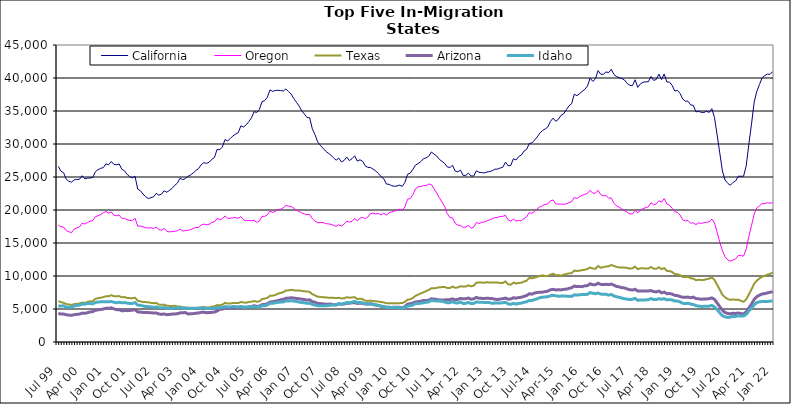
| Category | California | Oregon | Texas | Arizona | Idaho |
|---|---|---|---|---|---|
| Jul 99 | 26605 | 17749 | 6209 | 4339 | 5471 |
| Aug 99 | 25882 | 17447 | 6022 | 4228 | 5444 |
| Sep 99 | 25644 | 17401 | 5941 | 4237 | 5488 |
| Oct 99 | 24669 | 16875 | 5751 | 4134 | 5279 |
| Nov 99 | 24353 | 16701 | 5680 | 4073 | 5260 |
| Dec 99 | 24218 | 16570 | 5619 | 4042 | 5269 |
| Jan 00 | 24574 | 17109 | 5736 | 4142 | 5485 |
| Feb 00 | 24620 | 17295 | 5789 | 4192 | 5530 |
| Mar 00 | 24655 | 17436 | 5826 | 4226 | 5590 |
| Apr 00 | 25195 | 18009 | 5980 | 4375 | 5748 |
| May 00 | 24730 | 17875 | 5897 | 4337 | 5729 |
| Jun 00 | 24825 | 18113 | 6070 | 4444 | 5853 |
| Jul 00 | 24857 | 18294 | 6163 | 4555 | 5824 |
| Aug 00 | 24913 | 18376 | 6199 | 4603 | 5788 |
| Sep 00 | 25792 | 18971 | 6529 | 4804 | 5976 |
| Oct 00 | 26106 | 19135 | 6643 | 4870 | 6058 |
| Nov 00 | 26315 | 19306 | 6705 | 4926 | 6085 |
| Dec 00 | 26415 | 19570 | 6793 | 4991 | 6096 |
| Jan 01 | 26995 | 19781 | 6942 | 5122 | 6119 |
| Feb 01 | 26851 | 19519 | 6948 | 5089 | 6090 |
| Mar 01 | 27352 | 19720 | 7080 | 5180 | 6143 |
| Apr 01 | 26918 | 19221 | 6943 | 5020 | 6020 |
| May 01 | 26848 | 19126 | 6924 | 4899 | 5950 |
| Jun 01 | 26974 | 19241 | 6959 | 4895 | 6019 |
| Jul 01 | 26172 | 18725 | 6778 | 4737 | 5951 |
| Aug 01 | 25943 | 18736 | 6810 | 4757 | 5973 |
| Sep 01 | 25399 | 18514 | 6688 | 4753 | 5895 |
| Oct 01 | 25050 | 18415 | 6650 | 4780 | 5833 |
| Nov 01 | 24873 | 18381 | 6631 | 4826 | 5850 |
| Dec 01 | 25099 | 18765 | 6708 | 4898 | 5969 |
| Jan 02 | 23158 | 17561 | 6261 | 4560 | 5595 |
| Feb 02 | 22926 | 17573 | 6162 | 4531 | 5560 |
| Mar 02 | 22433 | 17452 | 6052 | 4481 | 5458 |
| Apr 02 | 22012 | 17314 | 6046 | 4458 | 5380 |
| May 02 | 21733 | 17267 | 6007 | 4452 | 5358 |
| Jun 02 | 21876 | 17298 | 5933 | 4444 | 5315 |
| Jul 02 | 21997 | 17209 | 5873 | 4383 | 5243 |
| Aug 02 | 22507 | 17436 | 5929 | 4407 | 5315 |
| Sep 02 | 22244 | 17010 | 5672 | 4248 | 5192 |
| Oct 02 | 22406 | 16952 | 5625 | 4191 | 5167 |
| Nov 02 | 22922 | 17223 | 5663 | 4242 | 5221 |
| Dec 02 | 22693 | 16770 | 5499 | 4142 | 5120 |
| Jan 03 | 22964 | 16694 | 5463 | 4166 | 5089 |
| Feb 03 | 23276 | 16727 | 5461 | 4226 | 5077 |
| Mar 03 | 23736 | 16766 | 5486 | 4251 | 5145 |
| Apr 03 | 24079 | 16859 | 5389 | 4289 | 5145 |
| May 03 | 24821 | 17117 | 5378 | 4415 | 5254 |
| Jun 03 | 24592 | 16812 | 5273 | 4426 | 5135 |
| Jul 03 | 24754 | 16875 | 5226 | 4466 | 5124 |
| Aug 03 | 25092 | 16922 | 5181 | 4244 | 5100 |
| Sep 03 | 25316 | 17036 | 5181 | 4279 | 5086 |
| Oct 03 | 25622 | 17228 | 5139 | 4301 | 5110 |
| Nov 03 | 25984 | 17335 | 5175 | 4362 | 5091 |
| Dec 03 | 26269 | 17350 | 5189 | 4396 | 5113 |
| Jan 04 | 26852 | 17734 | 5255 | 4492 | 5152 |
| Feb 04 | 27184 | 17860 | 5301 | 4502 | 5183 |
| Mar 04 | 27062 | 17757 | 5227 | 4443 | 5056 |
| Apr 04 | 27238 | 17840 | 5227 | 4461 | 5104 |
| May 04 | 27671 | 18113 | 5345 | 4493 | 5095 |
| Jun 04 | 27949 | 18201 | 5416 | 4532 | 5103 |
| Jul 04 | 29172 | 18727 | 5597 | 4697 | 5231 |
| Aug 04 | 29122 | 18529 | 5561 | 4945 | 5197 |
| Sep 04 | 29542 | 18678 | 5656 | 4976 | 5237 |
| Oct 04 | 30674 | 19108 | 5922 | 5188 | 5363 |
| Nov 04 | 30472 | 18716 | 5823 | 5106 | 5321 |
| Dec 04 | 30831 | 18755 | 5838 | 5135 | 5312 |
| Jan 05 | 31224 | 18823 | 5906 | 5155 | 5374 |
| Feb 05 | 31495 | 18842 | 5898 | 5168 | 5357 |
| Mar 05 | 31714 | 18738 | 5894 | 5212 | 5313 |
| Apr 05 | 32750 | 18998 | 6060 | 5340 | 5350 |
| May 05 | 32575 | 18504 | 5989 | 5269 | 5276 |
| Jun 05 | 32898 | 18414 | 5954 | 5252 | 5271 |
| Jul 05 | 33384 | 18395 | 6062 | 5322 | 5322 |
| Aug 05 | 33964 | 18381 | 6113 | 5375 | 5316 |
| Sep 05 | 34897 | 18426 | 6206 | 5493 | 5362 |
| Oct 05 | 34780 | 18132 | 6100 | 5408 | 5308 |
| Nov 05 | 35223 | 18332 | 6162 | 5434 | 5314 |
| Dec 05 | 36415 | 19047 | 6508 | 5658 | 5487 |
| Jan 06 | 36567 | 19032 | 6576 | 5688 | 5480 |
| Feb 06 | 37074 | 19257 | 6692 | 5792 | 5616 |
| Mar 06 | 38207 | 19845 | 6993 | 6052 | 5850 |
| Apr 06 | 37976 | 19637 | 7024 | 6101 | 5864 |
| May 06 | 38099 | 19781 | 7114 | 6178 | 5943 |
| Jun 06 | 38141 | 20061 | 7331 | 6276 | 6018 |
| Jul 06 | 38097 | 20111 | 7431 | 6399 | 6046 |
| Aug 06 | 38021 | 20333 | 7542 | 6450 | 6064 |
| Sep 06 | 38349 | 20686 | 7798 | 6627 | 6232 |
| Oct 06 | 37947 | 20591 | 7825 | 6647 | 6216 |
| Nov 06 | 37565 | 20526 | 7907 | 6707 | 6244 |
| Dec 06 | 36884 | 20272 | 7840 | 6648 | 6192 |
| Jan 07 | 36321 | 19984 | 7789 | 6597 | 6151 |
| Feb 07 | 35752 | 19752 | 7799 | 6554 | 6048 |
| Mar 07 | 35025 | 19547 | 7737 | 6487 | 5989 |
| Apr 07 | 34534 | 19412 | 7685 | 6430 | 5937 |
| May 07 | 34022 | 19296 | 7654 | 6353 | 5858 |
| Jun 07 | 33974 | 19318 | 7577 | 6390 | 5886 |
| Jul 07 | 32298 | 18677 | 7250 | 6117 | 5682 |
| Aug 07 | 31436 | 18322 | 7070 | 6034 | 5617 |
| Sep 07 | 30331 | 18087 | 6853 | 5847 | 5500 |
| Oct 07 | 29813 | 18108 | 6839 | 5821 | 5489 |
| Nov 07 | 29384 | 18105 | 6777 | 5769 | 5481 |
| Dec 07 | 28923 | 17949 | 6760 | 5733 | 5499 |
| Jan 08 | 28627 | 17890 | 6721 | 5732 | 5521 |
| Feb 08 | 28328 | 17834 | 6719 | 5749 | 5579 |
| Mar 08 | 27911 | 17680 | 6690 | 5650 | 5614 |
| Apr 08 | 27543 | 17512 | 6656 | 5612 | 5635 |
| May 08 | 27856 | 17754 | 6705 | 5774 | 5798 |
| Jun 08 | 27287 | 17589 | 6593 | 5717 | 5745 |
| Jul 08 | 27495 | 17834 | 6623 | 5761 | 5807 |
| Aug 08 | 28018 | 18309 | 6789 | 5867 | 5982 |
| Sep-08 | 27491 | 18164 | 6708 | 5864 | 5954 |
| Oct 08 | 27771 | 18291 | 6755 | 5942 | 6032 |
| Nov 08 | 28206 | 18706 | 6787 | 5970 | 6150 |
| Dec 08 | 27408 | 18353 | 6505 | 5832 | 5975 |
| Jan 09 | 27601 | 18778 | 6569 | 5890 | 5995 |
| Feb 09 | 27394 | 18863 | 6483 | 5845 | 5936 |
| Mar 09 | 26690 | 18694 | 6273 | 5751 | 5806 |
| Apr 09 | 26461 | 18943 | 6222 | 5735 | 5777 |
| May 09 | 26435 | 19470 | 6272 | 5819 | 5767 |
| Jun 09 | 26187 | 19522 | 6199 | 5700 | 5649 |
| Jul 09 | 25906 | 19408 | 6171 | 5603 | 5617 |
| Aug 09 | 25525 | 19469 | 6128 | 5533 | 5540 |
| Sep 09 | 25050 | 19249 | 6059 | 5405 | 5437 |
| Oct 09 | 24741 | 19529 | 6004 | 5349 | 5369 |
| Nov 09 | 23928 | 19187 | 5854 | 5271 | 5248 |
| Dec 09 | 23899 | 19607 | 5886 | 5261 | 5195 |
| Jan 10 | 23676 | 19703 | 5881 | 5232 | 5234 |
| Feb 10 | 23592 | 19845 | 5850 | 5272 | 5236 |
| Mar 10 | 23634 | 19946 | 5864 | 5278 | 5219 |
| Apr 10 | 23774 | 20134 | 5889 | 5257 | 5201 |
| May 10 | 23567 | 19966 | 5897 | 5172 | 5105 |
| Jun 10 | 24166 | 20464 | 6087 | 5356 | 5237 |
| Jul 10 | 25410 | 21627 | 6417 | 5742 | 5452 |
| Aug 10 | 25586 | 21744 | 6465 | 5797 | 5491 |
| Sep 10 | 26150 | 22314 | 6667 | 5907 | 5609 |
| Oct 10 | 26807 | 23219 | 6986 | 6070 | 5831 |
| Nov 10 | 27033 | 23520 | 7179 | 6100 | 5810 |
| Dec 10 | 27332 | 23551 | 7361 | 6182 | 5898 |
| Jan 11 | 27769 | 23697 | 7525 | 6276 | 5938 |
| Feb 11 | 27898 | 23718 | 7708 | 6267 | 6016 |
| Mar 11 | 28155 | 23921 | 7890 | 6330 | 6081 |
| Apr 11 | 28790 | 23847 | 8146 | 6544 | 6305 |
| May 11 | 28471 | 23215 | 8131 | 6502 | 6248 |
| Jun 11 | 28191 | 22580 | 8199 | 6445 | 6217 |
| Jul 11 | 27678 | 21867 | 8291 | 6368 | 6202 |
| Aug 11 | 27372 | 21203 | 8321 | 6356 | 6146 |
| Sep 11 | 27082 | 20570 | 8341 | 6387 | 6075 |
| Oct 11 | 26528 | 19442 | 8191 | 6402 | 5932 |
| Nov 11 | 26440 | 18872 | 8176 | 6426 | 5968 |
| Dec 11 | 26770 | 18784 | 8401 | 6533 | 6106 |
| Jan 12 | 25901 | 17963 | 8202 | 6390 | 5933 |
| Feb 12 | 25796 | 17718 | 8266 | 6456 | 5900 |
| Mar 12 | 26042 | 17647 | 8456 | 6600 | 6054 |
| Apr 12 | 25239 | 17386 | 8388 | 6534 | 5838 |
| May 12 | 25238 | 17407 | 8401 | 6558 | 5854 |
| Jun 12 | 25593 | 17673 | 8594 | 6669 | 6009 |
| Jul 12 | 25155 | 17237 | 8432 | 6474 | 5817 |
| Aug 12 | 25146 | 17391 | 8536 | 6539 | 5842 |
| Sep 12 | 25942 | 18102 | 8989 | 6759 | 6061 |
| Oct 12 | 25718 | 17953 | 9012 | 6618 | 6027 |
| Nov 12 | 25677 | 18134 | 9032 | 6611 | 6009 |
| Dec 12 | 25619 | 18166 | 8981 | 6601 | 5999 |
| Jan 13 | 25757 | 18344 | 9051 | 6627 | 5989 |
| Feb-13 | 25830 | 18512 | 9001 | 6606 | 5968 |
| Mar-13 | 25940 | 18689 | 9021 | 6577 | 5853 |
| Apr 13 | 26187 | 18844 | 9013 | 6478 | 5925 |
| May 13 | 26192 | 18884 | 9003 | 6431 | 5924 |
| Jun-13 | 26362 | 19013 | 8948 | 6508 | 5896 |
| Jul 13 | 26467 | 19037 | 8958 | 6559 | 5948 |
| Aug 13 | 27253 | 19198 | 9174 | 6655 | 6020 |
| Sep 13 | 26711 | 18501 | 8747 | 6489 | 5775 |
| Oct 13 | 26733 | 18301 | 8681 | 6511 | 5711 |
| Nov 13 | 27767 | 18620 | 8989 | 6709 | 5860 |
| Dec 13 | 27583 | 18320 | 8863 | 6637 | 5740 |
| Jan 14 | 28107 | 18409 | 8939 | 6735 | 5843 |
| Feb-14 | 28313 | 18383 | 8989 | 6779 | 5893 |
| Mar 14 | 28934 | 18696 | 9160 | 6918 | 6015 |
| Apr 14 | 29192 | 18946 | 9291 | 7036 | 6099 |
| May 14 | 30069 | 19603 | 9701 | 7314 | 6304 |
| Jun 14 | 30163 | 19487 | 9641 | 7252 | 6293 |
| Jul-14 | 30587 | 19754 | 9752 | 7415 | 6427 |
| Aug-14 | 31074 | 20201 | 9882 | 7499 | 6557 |
| Sep 14 | 31656 | 20459 | 9997 | 7536 | 6719 |
| Oct 14 | 32037 | 20663 | 10109 | 7555 | 6786 |
| Nov 14 | 32278 | 20825 | 9992 | 7628 | 6831 |
| Dec 14 | 32578 | 20918 | 10006 | 7705 | 6860 |
| Jan 15 | 33414 | 21396 | 10213 | 7906 | 7000 |
| Feb 15 | 33922 | 21518 | 10337 | 7982 | 7083 |
| Mar 15 | 33447 | 20942 | 10122 | 7891 | 7006 |
| Apr-15 | 33731 | 20893 | 10138 | 7906 | 6931 |
| May 15 | 34343 | 20902 | 10053 | 7895 | 6952 |
| Jun-15 | 34572 | 20870 | 10192 | 7973 | 6966 |
| Jul 15 | 35185 | 20916 | 10303 | 8000 | 6949 |
| Aug 15 | 35780 | 21115 | 10399 | 8126 | 6938 |
| Sep 15 | 36109 | 21246 | 10428 | 8207 | 6896 |
| Oct 15 | 37555 | 21908 | 10813 | 8477 | 7140 |
| Nov 15 | 37319 | 21750 | 10763 | 8390 | 7112 |
| Dec 15 | 37624 | 21990 | 10807 | 8395 | 7149 |
| Jan 16 | 37978 | 22248 | 10892 | 8388 | 7201 |
| Feb 16 | 38285 | 22369 | 10951 | 8508 | 7192 |
| Mar 16 | 38792 | 22506 | 11075 | 8547 | 7226 |
| Apr 16 | 39994 | 22999 | 11286 | 8815 | 7487 |
| May 16 | 39488 | 22548 | 11132 | 8673 | 7382 |
| Jun 16 | 39864 | 22556 | 11100 | 8682 | 7315 |
| Jul 16 | 41123 | 22989 | 11516 | 8903 | 7420 |
| Aug 16 | 40573 | 22333 | 11251 | 8731 | 7261 |
| Sep 16 | 40560 | 22162 | 11340 | 8692 | 7216 |
| Oct 16 | 40923 | 22172 | 11456 | 8742 | 7233 |
| Nov 16 | 40817 | 21818 | 11459 | 8685 | 7101 |
| Dec 16 | 41311 | 21815 | 11681 | 8783 | 7203 |
| Jan 17 | 40543 | 21029 | 11524 | 8609 | 6982 |
| Feb 17 | 40218 | 20613 | 11385 | 8416 | 6852 |
| Mar 17 | 40052 | 20425 | 11276 | 8354 | 6775 |
| Apr 17 | 39913 | 20147 | 11297 | 8218 | 6653 |
| May 17 | 39695 | 19910 | 11265 | 8196 | 6552 |
| Jun 17 | 39177 | 19650 | 11225 | 8034 | 6500 |
| Jul 17 | 38901 | 19419 | 11115 | 7923 | 6429 |
| Aug 17 | 38827 | 19389 | 11168 | 7867 | 6479 |
| Sep 17 | 39736 | 19936 | 11426 | 7991 | 6609 |
| Oct 17 | 38576 | 19547 | 11041 | 7708 | 6315 |
| Nov 17 | 39108 | 20013 | 11158 | 7746 | 6381 |
| Dec 17 | 39359 | 20202 | 11185 | 7743 | 6366 |
| Jan 18 | 39420 | 20362 | 11118 | 7736 | 6380 |
| Feb 18 | 39440 | 20476 | 11128 | 7741 | 6407 |
| Mar 18 | 40218 | 21106 | 11362 | 7789 | 6578 |
| Apr 18 | 39637 | 20788 | 11111 | 7642 | 6423 |
| May 18 | 39777 | 20933 | 11097 | 7591 | 6430 |
| Jun 18 | 40602 | 21381 | 11317 | 7721 | 6554 |
| Jul 18 | 39767 | 21189 | 11038 | 7445 | 6489 |
| Aug 18 | 40608 | 21729 | 11200 | 7560 | 6569 |
| Sep 18 | 39395 | 20916 | 10772 | 7318 | 6383 |
| Oct 18 | 39383 | 20724 | 10740 | 7344 | 6429 |
| Nov 18 | 38891 | 20265 | 10605 | 7255 | 6365 |
| Dec 18 | 38013 | 19741 | 10292 | 7069 | 6205 |
| Jan 19 | 38130 | 19643 | 10261 | 7032 | 6203 |
| Feb 19 | 37658 | 19237 | 10132 | 6892 | 6073 |
| Mar 19 | 36831 | 18492 | 9848 | 6766 | 5863 |
| Apr 19 | 36492 | 18349 | 9839 | 6763 | 5827 |
| May 19 | 36481 | 18407 | 9867 | 6809 | 5873 |
| Jun 19 | 35925 | 17998 | 9661 | 6698 | 5761 |
| Jul 19 | 35843 | 18049 | 9598 | 6800 | 5673 |
| Aug 19 | 34870 | 17785 | 9361 | 6577 | 5512 |
| Sep 19 | 34945 | 18038 | 9428 | 6547 | 5437 |
| Oct 19 | 34802 | 17977 | 9385 | 6483 | 5390 |
| Nov 19 | 34775 | 18072 | 9403 | 6511 | 5401 |
| Dec 19 | 34976 | 18140 | 9518 | 6521 | 5419 |
| Jan 20 | 34774 | 18209 | 9594 | 6561 | 5434 |
| Feb 20 | 35352 | 18632 | 9804 | 6682 | 5543 |
| Mar 20 | 34013 | 18041 | 9411 | 6464 | 5330 |
| Apr 20 | 31385 | 16629 | 8666 | 5922 | 4906 |
| May 20 | 28657 | 15123 | 7927 | 5355 | 4419 |
| Jun 20 | 25915 | 13817 | 7164 | 4815 | 3992 |
| Jul 20 | 24545 | 12926 | 6776 | 4457 | 3810 |
| Aug 20 | 24048 | 12443 | 6521 | 4326 | 3720 |
| Sep 20 | 23756 | 12258 | 6386 | 4266 | 3784 |
| Oct 20 | 24166 | 12429 | 6452 | 4347 | 3861 |
| Nov 20 | 24404 | 12597 | 6386 | 4324 | 3883 |
| Dec 20 | 25120 | 13122 | 6420 | 4394 | 3974 |
| Jan 21 | 25111 | 13080 | 6236 | 4304 | 3924 |
| Feb 21 | 25114 | 13015 | 6094 | 4260 | 3930 |
| Mar 21 | 26701 | 14096 | 6455 | 4567 | 4185 |
| Apr 21 | 29998 | 15978 | 7222 | 5164 | 4697 |
| May 21 | 33020 | 17641 | 7969 | 5748 | 5148 |
| Jun 21 | 36320 | 19369 | 8840 | 6450 | 5628 |
| Jul 21 | 37989 | 20320 | 9306 | 6877 | 5984 |
| Aug 21 | 39007 | 20657 | 9615 | 7094 | 6084 |
| Sep 21 | 40023 | 20974 | 9914 | 7277 | 6151 |
| Oct 21 | 40348 | 20966 | 10003 | 7327 | 6140 |
| Nov 21 | 40599 | 21096 | 10203 | 7437 | 6136 |
| Dec 21 | 40548 | 21032 | 10328 | 7532 | 6183 |
| Jan 22 | 40967 | 21106 | 10535 | 7618 | 6237 |